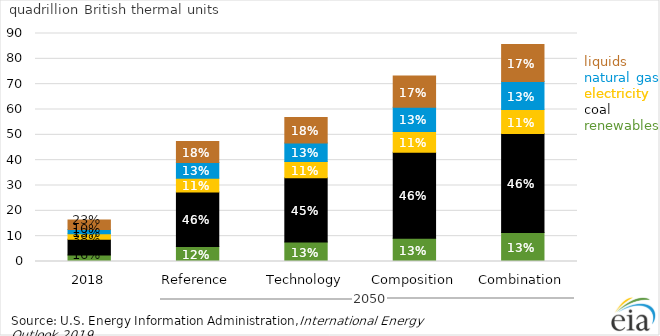
| Category | Renewables | Coal | Electricity | Natural gas | Liquids |
|---|---|---|---|---|---|
| 2018 | 2.551 | 6.246 | 2.162 | 1.681 | 3.696 |
| Reference | 5.904 | 21.543 | 5.437 | 6.147 | 8.306 |
| Technology | 7.653 | 25.429 | 6.427 | 7.25 | 10.102 |
| Composition | 9.225 | 33.931 | 8.196 | 9.56 | 12.281 |
| Combination | 11.479 | 39.009 | 9.497 | 11.056 | 14.642 |